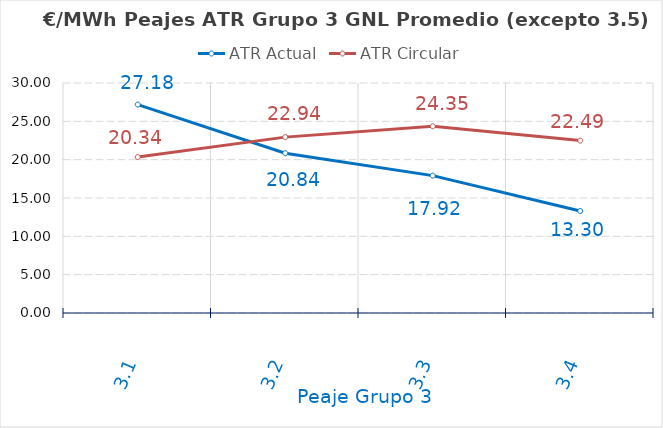
| Category | ATR Actual | ATR Circular |
|---|---|---|
| 3.1 | 27.185 | 20.338 |
| 3.2 | 20.842 | 22.941 |
| 3.3 | 17.917 | 24.351 |
| 3.4 | 13.3 | 22.485 |